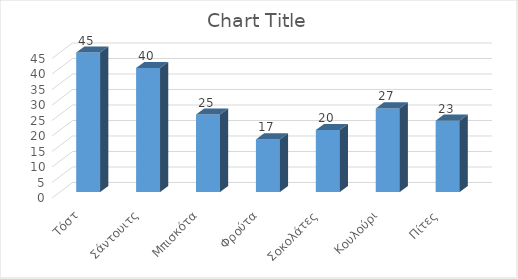
| Category | Series 0 |
|---|---|
|    Τόστ | 45 |
| Σάντουιτς | 40 |
| Μπισκότα | 25 |
| Φρούτα | 17 |
| Σοκολάτες | 20 |
| Κουλούρι | 27 |
| Πίτες | 23 |